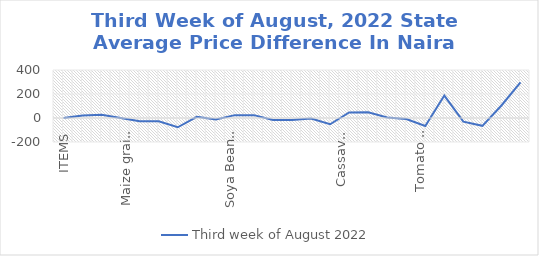
| Category | Third week of August 2022 |
|---|---|
| ITEMS | 0 |
| Rice, Imported, High Quality Sold loose  (1 mudu) | 21.739 |
| Rice, Agric Sold Loose(Low quality) imported  (1 mudu) | 26.087 |
| Rice Local, Sold Loose   (1 mudu) | 0 |
| Maize grain, white sold loose   (1 mudu) | -26.304 |
| Maize grain, yellow sold loose   (1 mudu) | -27.174 |
| Sorghum (Guinea Corn) white or brown, sold loose   (1 mudu) | -77.391 |
| millet (jero or maiwa) sold loose   (1 mudu) | 9.565 |
| Beans: white black eye. Sold loose   (1 mudu) | -13.043 |
| Beans Brown, sold loose  (1 mudu) | 23.913 |
| Soya Beans, sold loose    (1 mudu) | 23.913 |
| Gari White, sold loose  (1 mudu) | -17.391 |
| Gari Yellow, sold loose   (1 mudu) | -17.391 |
| Palm oil (1 schnap bottle) | -5.217 |
| Yam tuber (1 Medium Size) | -52.174 |
| Cassava tuber | 46.522 |
| Irish potato  (4 Litre rubber) | 47.826 |
| Sweet potato  (5 Medium Size) | 4.348 |
| Local live chicken  | -8.696 |
| Groundnut - shelled (fresh) | -66.304 |
| Tomato fresh   (4 Litre rubber) | 186.957 |
| Okro fresh     (1 mudu) | -30.435 |
| Okro dried    (1 mudu) | -65.217 |
| Onion   (4 Litre rubber) | 104.348 |
| Pepper fresh   (4 Litre rubber) | 297.826 |